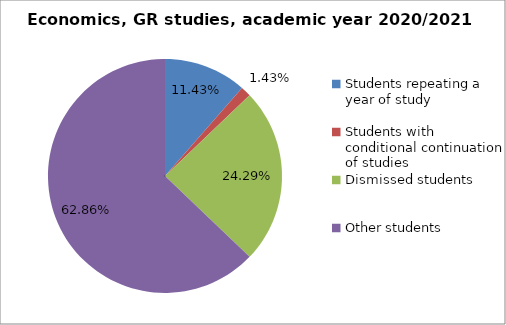
| Category | Series 0 |
|---|---|
| Students repeating a year of study | 8 |
| Students with conditional continuation of studies | 1 |
| Dismissed students | 17 |
| Other students | 44 |